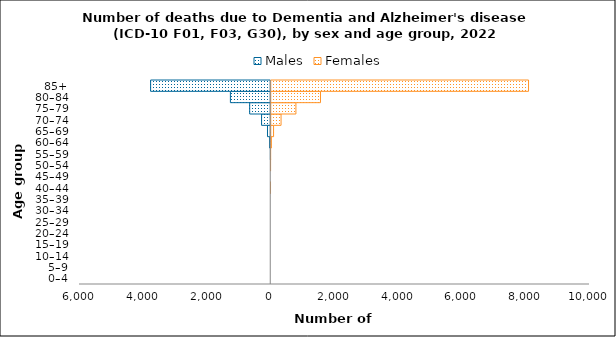
| Category | Males | Females |
|---|---|---|
| 0–4 | 0 | 0 |
| 5–9 | 0 | 0 |
| 10–14 | 0 | 0 |
| 15–19 | 0 | 0 |
| 20–24 | 0 | 0 |
| 25–29 | 0 | 0 |
| 30–34 | 0 | 0 |
| 35–39 | 0 | 0 |
| 40–44 | 0 | 1 |
| 45–49 | 0 | 0 |
| 50–54 | 0 | 5 |
| 55–59 | -9 | 9 |
| 60–64 | -35 | 34 |
| 65–69 | -102 | 104 |
| 70–74 | -288 | 339 |
| 75–79 | -661 | 805 |
| 80–84 | -1266 | 1576 |
| 85+ | -3769 | 8103 |